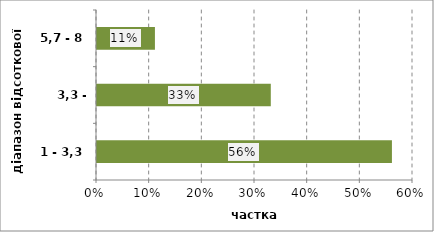
| Category | Series 0 |
|---|---|
| 1 - 3,3 | 0.56 |
| 3,3 - 5,7 | 0.33 |
| 5,7 - 8 | 0.11 |